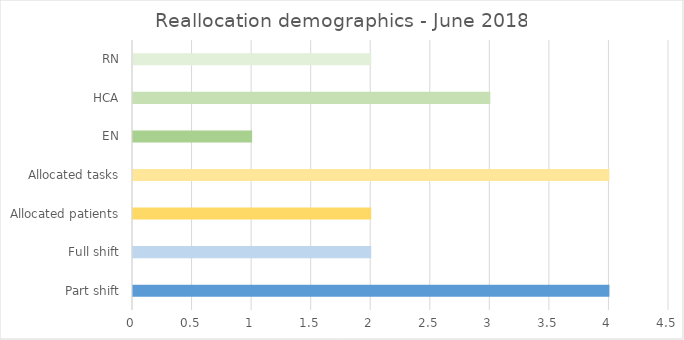
| Category | Number |
|---|---|
| Part shift | 4 |
| Full shift | 2 |
| Allocated patients | 2 |
| Allocated tasks | 4 |
| EN | 1 |
| HCA | 3 |
| RN | 2 |